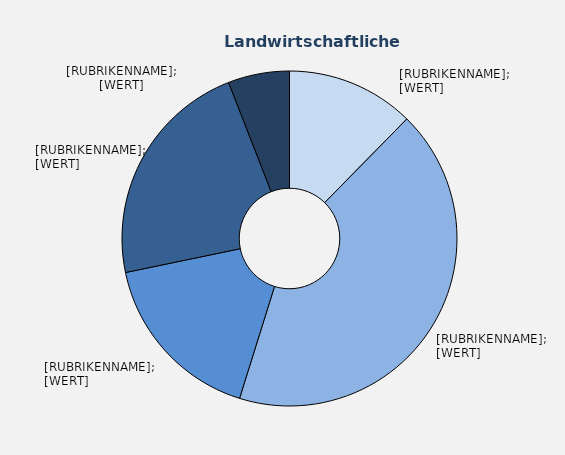
| Category | Series 1 |
|---|---|
| Ackerbaubetriebe | 12.352 |
| Gartenbaubetriebe | 42.47 |
| Dauerkulturbetriebe | 16.92 |
| Futterbaubetriebe | 22.335 |
| Veredlungs- und Verbundbetriebe | 5.922 |